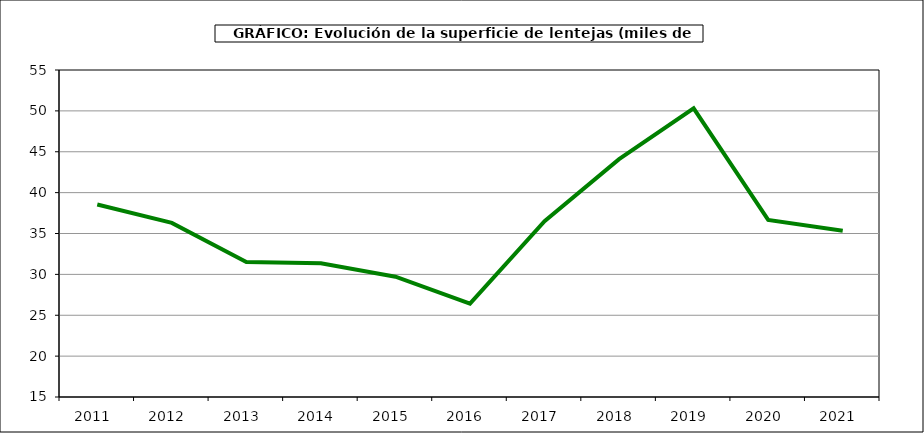
| Category | Superficie |
|---|---|
| 2011.0 | 38.55 |
| 2012.0 | 36.298 |
| 2013.0 | 31.506 |
| 2014.0 | 31.35 |
| 2015.0 | 29.72 |
| 2016.0 | 26.427 |
| 2017.0 | 36.504 |
| 2018.0 | 44.101 |
| 2019.0 | 50.318 |
| 2020.0 | 36.667 |
| 2021.0 | 35.341 |